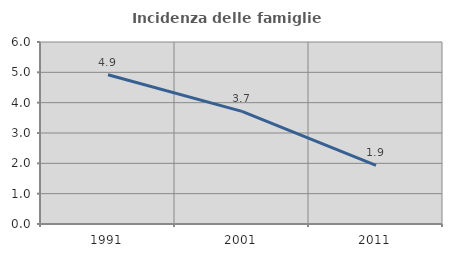
| Category | Incidenza delle famiglie numerose |
|---|---|
| 1991.0 | 4.918 |
| 2001.0 | 3.712 |
| 2011.0 | 1.935 |